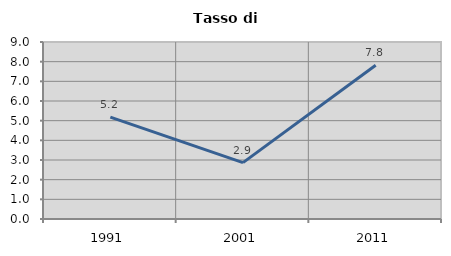
| Category | Tasso di disoccupazione   |
|---|---|
| 1991.0 | 5.178 |
| 2001.0 | 2.865 |
| 2011.0 | 7.818 |